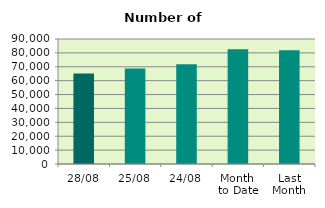
| Category | Series 0 |
|---|---|
| 28/08 | 65178 |
| 25/08 | 68746 |
| 24/08 | 71868 |
| Month 
to Date | 82654.3 |
| Last
Month | 81818 |